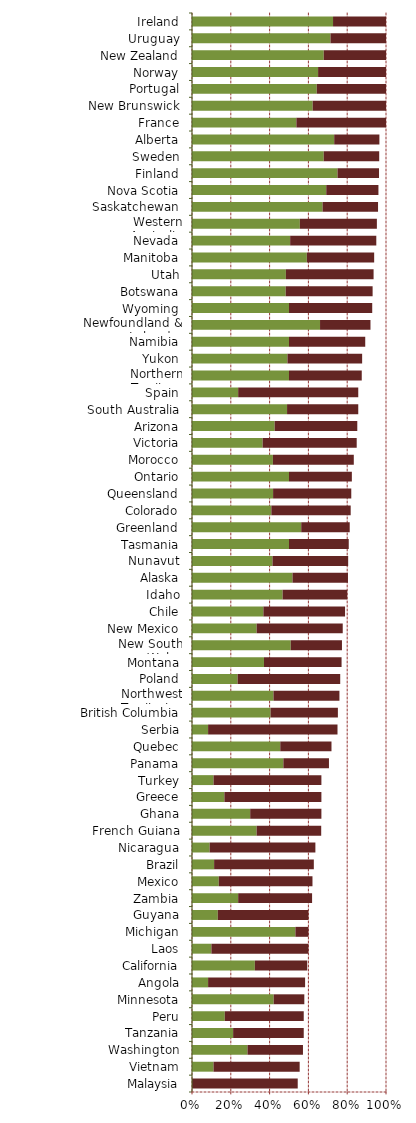
| Category |   Encourages Investment |   Not a Deterrent to Investment |
|---|---|---|
| Malaysia | 0 | 0.545 |
| Vietnam | 0.111 | 0.444 |
| Washington | 0.286 | 0.286 |
| Tanzania | 0.212 | 0.364 |
| Peru | 0.169 | 0.407 |
| Minnesota | 0.421 | 0.158 |
| Angola | 0.083 | 0.5 |
| California | 0.324 | 0.27 |
| Laos | 0.1 | 0.5 |
| Michigan | 0.533 | 0.067 |
| Guyana | 0.133 | 0.467 |
| Zambia | 0.238 | 0.381 |
| Mexico | 0.138 | 0.483 |
| Brazil | 0.114 | 0.514 |
| Nicaragua | 0.091 | 0.545 |
| French Guiana | 0.333 | 0.333 |
| Ghana | 0.3 | 0.367 |
| Greece | 0.167 | 0.5 |
| Turkey | 0.111 | 0.556 |
| Panama | 0.471 | 0.235 |
| Quebec | 0.455 | 0.264 |
| Serbia | 0.083 | 0.667 |
| British Columbia | 0.405 | 0.347 |
| Northwest Territories | 0.42 | 0.34 |
| Poland | 0.235 | 0.529 |
| Montana | 0.371 | 0.4 |
| New South Wales | 0.509 | 0.264 |
| New Mexico | 0.333 | 0.444 |
| Chile | 0.368 | 0.421 |
| Idaho | 0.467 | 0.333 |
| Alaska | 0.518 | 0.286 |
| Nunavut | 0.415 | 0.39 |
| Tasmania | 0.5 | 0.308 |
| Greenland | 0.563 | 0.25 |
| Colorado | 0.409 | 0.409 |
| Queensland | 0.418 | 0.403 |
| Ontario | 0.5 | 0.324 |
| Morocco | 0.417 | 0.417 |
| Victoria | 0.364 | 0.485 |
| Arizona | 0.426 | 0.426 |
| South Australia | 0.49 | 0.367 |
| Spain | 0.238 | 0.619 |
| Northern Territory | 0.5 | 0.375 |
| Yukon | 0.492 | 0.385 |
| Namibia | 0.5 | 0.393 |
| Newfoundland & Labrador | 0.66 | 0.26 |
| Wyoming | 0.5 | 0.429 |
| Botswana | 0.483 | 0.448 |
| Utah | 0.484 | 0.452 |
| Manitoba | 0.592 | 0.347 |
| Nevada | 0.506 | 0.444 |
| Western Australia | 0.556 | 0.397 |
| Saskatchewan | 0.673 | 0.286 |
| Nova Scotia | 0.692 | 0.269 |
| Finland | 0.75 | 0.214 |
| Sweden | 0.679 | 0.286 |
| Alberta | 0.733 | 0.233 |
| France | 0.538 | 0.462 |
| New Brunswick | 0.622 | 0.378 |
| Portugal | 0.643 | 0.357 |
| Norway | 0.65 | 0.35 |
| New Zealand | 0.679 | 0.321 |
| Uruguay | 0.714 | 0.286 |
| Ireland | 0.727 | 0.273 |